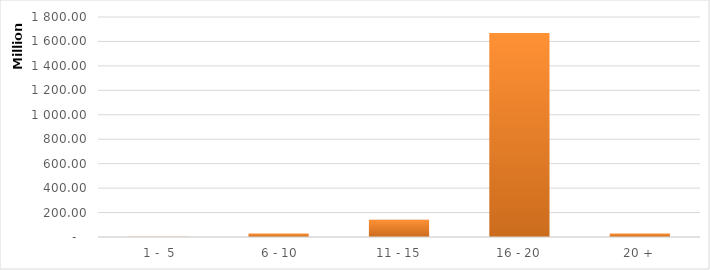
| Category | Series 0 |
|---|---|
|  1 -  5 | 2694113.79 |
|  6 - 10 | 28797529.48 |
| 11 - 15 | 141860089.98 |
| 16 - 20 | 1668977153.42 |
| 20 + | 29332666.54 |